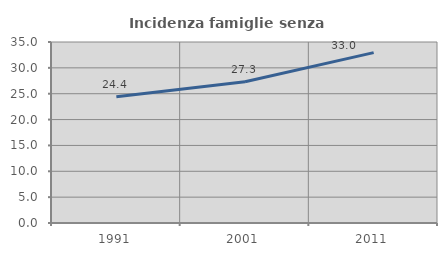
| Category | Incidenza famiglie senza nuclei |
|---|---|
| 1991.0 | 24.433 |
| 2001.0 | 27.297 |
| 2011.0 | 32.95 |